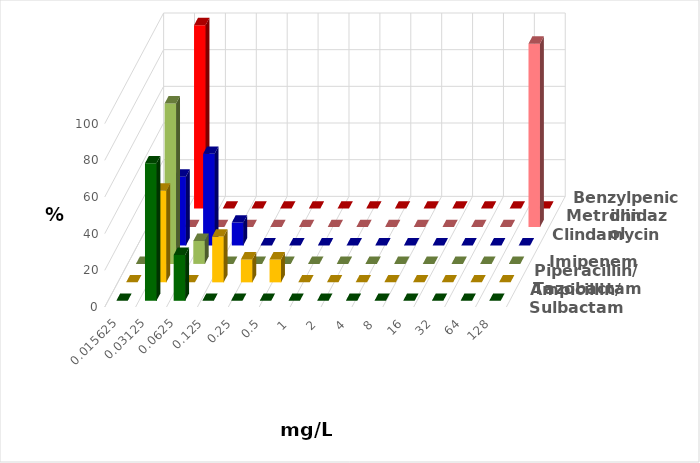
| Category | Ampicillin/ Sulbactam | Piperacillin/ Tazobactam | Imipenem | Clindamycin | Metronidazol | Benzylpenicillin |
|---|---|---|---|---|---|---|
| 0.015625 | 0 | 0 | 0 | 0 | 0 | 0 |
| 0.03125 | 75 | 50 | 87.5 | 37.5 | 0 | 100 |
| 0.0625 | 25 | 0 | 12.5 | 50 | 0 | 0 |
| 0.125 | 0 | 25 | 0 | 12.5 | 0 | 0 |
| 0.25 | 0 | 12.5 | 0 | 0 | 0 | 0 |
| 0.5 | 0 | 12.5 | 0 | 0 | 0 | 0 |
| 1.0 | 0 | 0 | 0 | 0 | 0 | 0 |
| 2.0 | 0 | 0 | 0 | 0 | 0 | 0 |
| 4.0 | 0 | 0 | 0 | 0 | 0 | 0 |
| 8.0 | 0 | 0 | 0 | 0 | 0 | 0 |
| 16.0 | 0 | 0 | 0 | 0 | 0 | 0 |
| 32.0 | 0 | 0 | 0 | 0 | 0 | 0 |
| 64.0 | 0 | 0 | 0 | 0 | 0 | 0 |
| 128.0 | 0 | 0 | 0 | 0 | 100 | 0 |